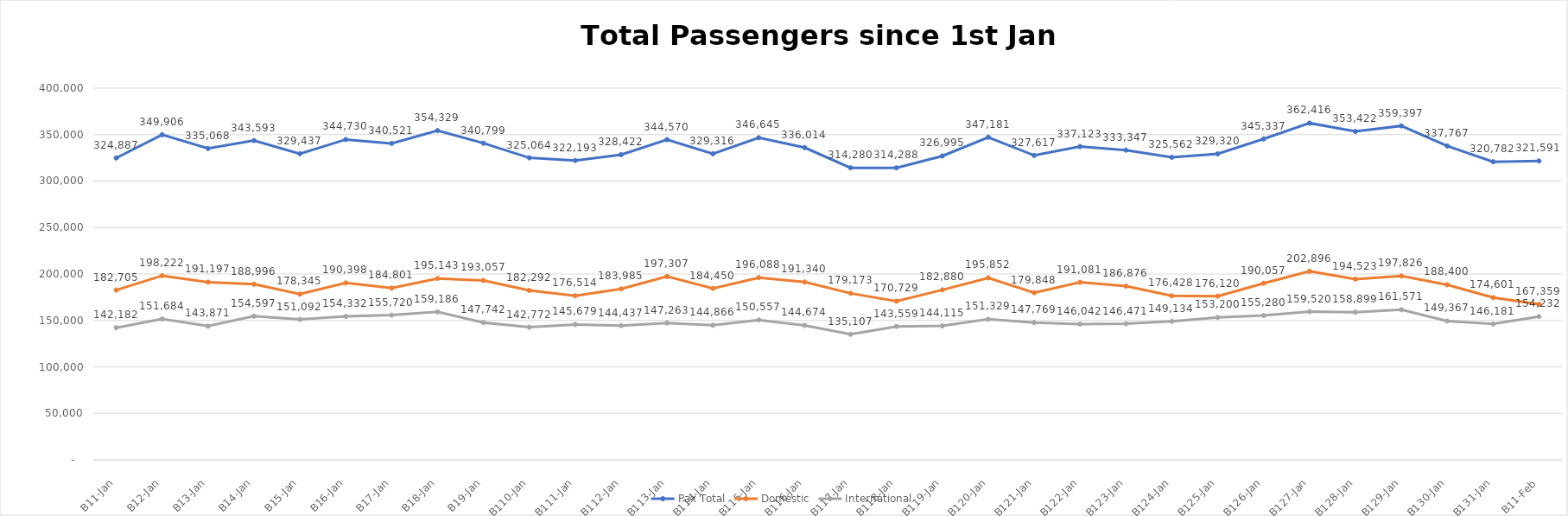
| Category | Pax Total |  Domestic  |  International  |
|---|---|---|---|
| 2023-01-01 | 324887 | 182705 | 142182 |
| 2023-01-02 | 349906 | 198222 | 151684 |
| 2023-01-03 | 335068 | 191197 | 143871 |
| 2023-01-04 | 343593 | 188996 | 154597 |
| 2023-01-05 | 329437 | 178345 | 151092 |
| 2023-01-06 | 344730 | 190398 | 154332 |
| 2023-01-07 | 340521 | 184801 | 155720 |
| 2023-01-08 | 354329 | 195143 | 159186 |
| 2023-01-09 | 340799 | 193057 | 147742 |
| 2023-01-10 | 325064 | 182292 | 142772 |
| 2023-01-11 | 322193 | 176514 | 145679 |
| 2023-01-12 | 328422 | 183985 | 144437 |
| 2023-01-13 | 344570 | 197307 | 147263 |
| 2023-01-14 | 329316 | 184450 | 144866 |
| 2023-01-15 | 346645 | 196088 | 150557 |
| 2023-01-16 | 336014 | 191340 | 144674 |
| 2023-01-17 | 314280 | 179173 | 135107 |
| 2023-01-18 | 314288 | 170729 | 143559 |
| 2023-01-19 | 326995 | 182880 | 144115 |
| 2023-01-20 | 347181 | 195852 | 151329 |
| 2023-01-21 | 327617 | 179848 | 147769 |
| 2023-01-22 | 337123 | 191081 | 146042 |
| 2023-01-23 | 333347 | 186876 | 146471 |
| 2023-01-24 | 325562 | 176428 | 149134 |
| 2023-01-25 | 329320 | 176120 | 153200 |
| 2023-01-26 | 345337 | 190057 | 155280 |
| 2023-01-27 | 362416 | 202896 | 159520 |
| 2023-01-28 | 353422 | 194523 | 158899 |
| 2023-01-29 | 359397 | 197826 | 161571 |
| 2023-01-30 | 337767 | 188400 | 149367 |
| 2023-01-31 | 320782 | 174601 | 146181 |
| 2023-02-01 | 321591 | 167359 | 154232 |